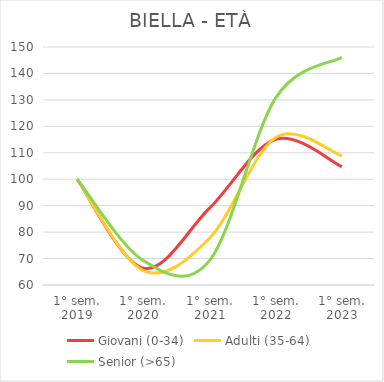
| Category | Giovani (0-34) | Adulti (35-64) | Senior (>65) |
|---|---|---|---|
| 1° sem.
2019 | 100 | 100 | 100 |
| 1° sem.
2020 | 66.366 | 65.474 | 69.231 |
| 1° sem.
2021 | 89.052 | 77.684 | 69.231 |
| 1° sem.
2022 | 115.124 | 115.789 | 130.769 |
| 1° sem.
2023 | 104.74 | 108.842 | 146.154 |